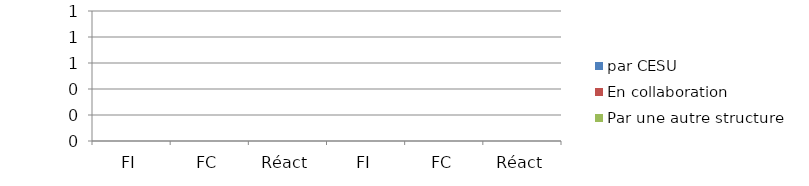
| Category | par CESU | En collaboration | Par une autre structure |
|---|---|---|---|
| FI | 0 | 0 | 0 |
| FC | 0 | 0 | 0 |
| Réact | 0 | 0 | 0 |
| FI | 0 | 0 | 0 |
| FC | 0 | 0 | 0 |
| Réact | 0 | 0 | 0 |